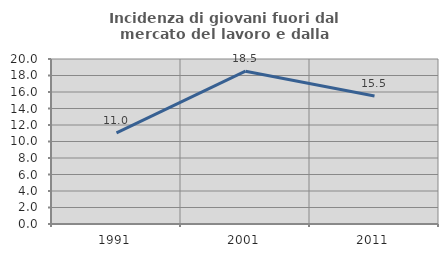
| Category | Incidenza di giovani fuori dal mercato del lavoro e dalla formazione  |
|---|---|
| 1991.0 | 11.039 |
| 2001.0 | 18.519 |
| 2011.0 | 15.504 |